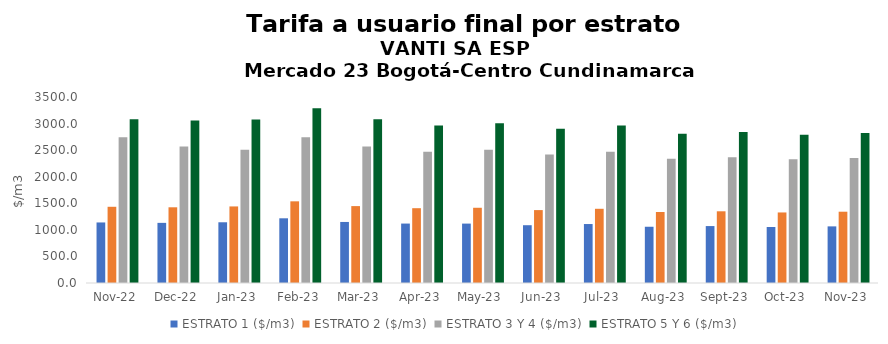
| Category | ESTRATO 1 ($/m3) | ESTRATO 2 ($/m3) | ESTRATO 3 Y 4 ($/m3) | ESTRATO 5 Y 6 ($/m3) |
|---|---|---|---|---|
| 2022-11-01 | 1139.35 | 1434.14 | 2741.78 | 3081.132 |
| 2022-12-01 | 1131.49 | 1424.62 | 2567.53 | 3057.768 |
| 2023-01-01 | 1142.83 | 1440.88 | 2506.69 | 3074.928 |
| 2023-02-01 | 1217.5 | 1536.84 | 2741.78 | 3290.136 |
| 2023-03-01 | 1148.64 | 1447.09 | 2567.53 | 3081.036 |
| 2023-04-01 | 1118.47 | 1407.56 | 2468.54 | 2962.248 |
| 2023-05-01 | 1117.85 | 1415.65 | 2506.69 | 3008.028 |
| 2023-06-01 | 1087.36 | 1371.98 | 2417.38 | 2900.856 |
| 2023-07-01 | 1109.69 | 1396.46 | 2468.54 | 2962.248 |
| 2023-08-01 | 1058.46 | 1336.01 | 2339.09 | 2806.908 |
| 2023-09-01 | 1071.3 | 1349.34 | 2366.44 | 2839.728 |
| 2023-10-01 | 1054.11 | 1327.47 | 2326.42 | 2791.704 |
| 2023-11-01 | 1065.47 | 1341.49 | 2350.92 | 2821.104 |